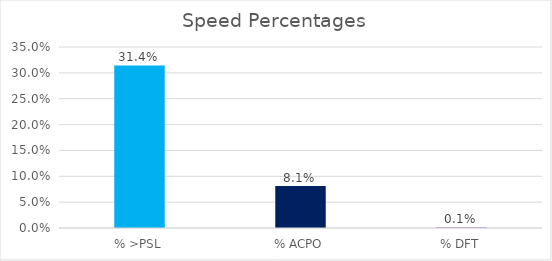
| Category | Series 0 |
|---|---|
| % >PSL | 0.314 |
| % ACPO | 0.081 |
| % DFT | 0.001 |